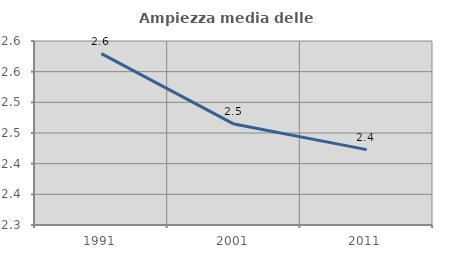
| Category | Ampiezza media delle famiglie |
|---|---|
| 1991.0 | 2.579 |
| 2001.0 | 2.465 |
| 2011.0 | 2.423 |